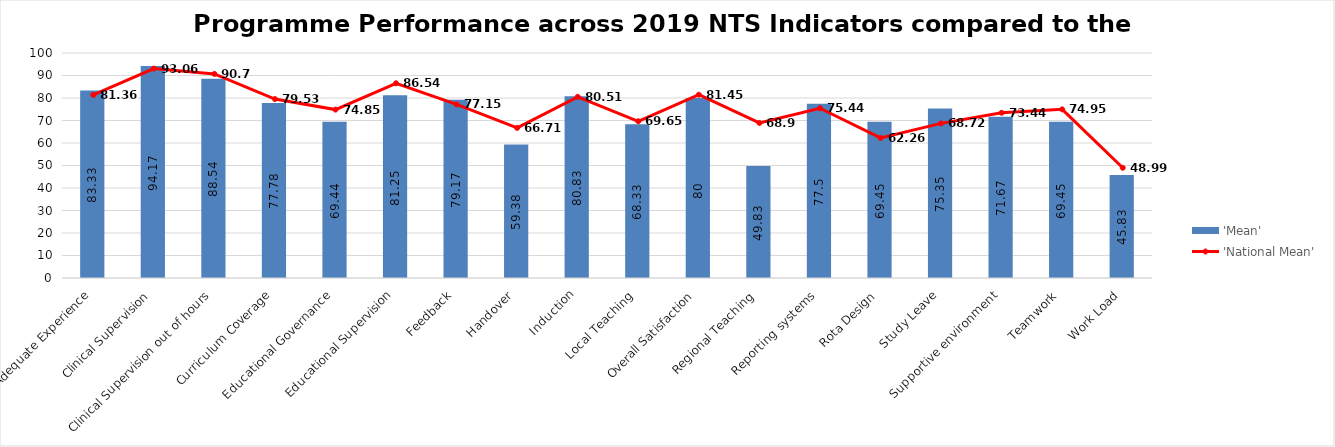
| Category | 'Mean' |
|---|---|
| Adequate Experience | 83.33 |
| Clinical Supervision | 94.17 |
| Clinical Supervision out of hours | 88.54 |
| Curriculum Coverage | 77.78 |
| Educational Governance | 69.44 |
| Educational Supervision | 81.25 |
| Feedback | 79.17 |
| Handover | 59.38 |
| Induction | 80.83 |
| Local Teaching | 68.33 |
| Overall Satisfaction | 80 |
| Regional Teaching | 49.83 |
| Reporting systems | 77.5 |
| Rota Design | 69.45 |
| Study Leave | 75.35 |
| Supportive environment | 71.67 |
| Teamwork | 69.45 |
| Work Load | 45.83 |